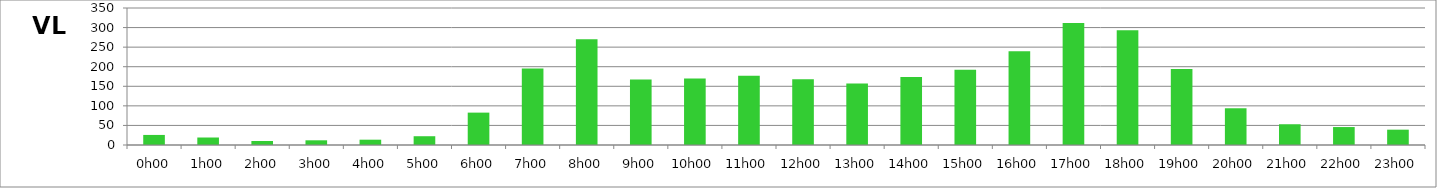
| Category | VL |
|---|---|
| 0.0 | 25.714 |
| 0.041666666666666664 | 19.143 |
| 0.08333333333333333 | 10.286 |
| 0.125 | 12 |
| 0.16666666666666666 | 13.571 |
| 0.20833333333333334 | 22.429 |
| 0.25 | 82.714 |
| 0.2916666666666667 | 195.143 |
| 0.3333333333333333 | 270.429 |
| 0.375 | 167.429 |
| 0.4166666666666667 | 170.143 |
| 0.4583333333333333 | 177 |
| 0.5 | 167.714 |
| 0.5416666666666666 | 157.429 |
| 0.5833333333333334 | 174 |
| 0.625 | 192.143 |
| 0.6666666666666666 | 239.286 |
| 0.7083333333333334 | 311.714 |
| 0.75 | 293.429 |
| 0.7916666666666666 | 194.143 |
| 0.8333333333333334 | 93.857 |
| 0.875 | 53 |
| 0.9166666666666666 | 45.857 |
| 0.9583333333333334 | 39.143 |